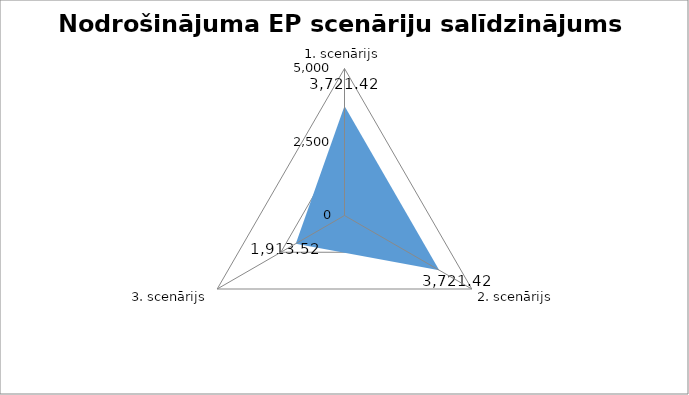
| Category | Series 0 |
|---|---|
| 1. scenārijs | 3721.423 |
| 2. scenārijs | 3721.423 |
| 3. scenārijs | 1913.519 |